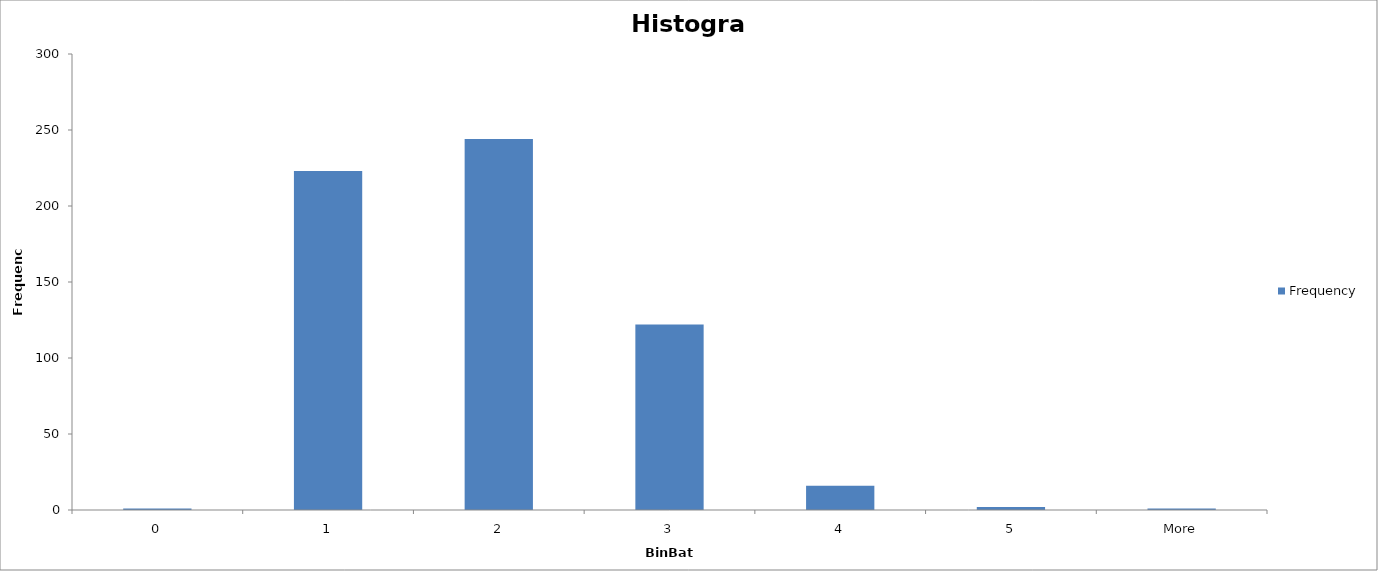
| Category | Frequency |
|---|---|
| 0 | 1 |
| 1 | 223 |
| 2 | 244 |
| 3 | 122 |
| 4 | 16 |
| 5 | 2 |
| More | 1 |